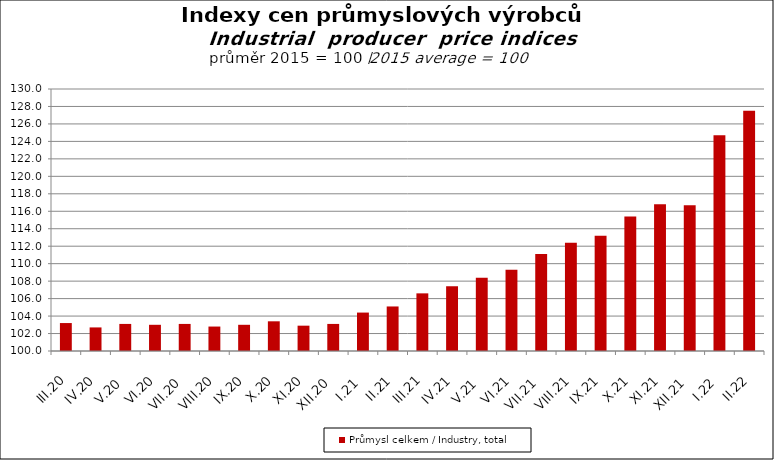
| Category | Průmysl celkem / Industry, total |
|---|---|
| III.20 | 103.2 |
| IV.20 | 102.7 |
| V.20 | 103.1 |
| VI.20 | 103 |
| VII.20 | 103.1 |
| VIII.20 | 102.8 |
| IX.20 | 103 |
| X.20 | 103.4 |
| XI.20 | 102.9 |
| XII.20 | 103.1 |
| I.21 | 104.4 |
| II.21 | 105.1 |
| III.21 | 106.6 |
| IV.21 | 107.4 |
| V.21 | 108.4 |
| VI.21 | 109.3 |
| VII.21 | 111.1 |
| VIII.21 | 112.4 |
| IX.21 | 113.2 |
| X.21 | 115.4 |
| XI.21 | 116.8 |
| XII.21 | 116.7 |
| I.22 | 124.7 |
| II.22 | 127.5 |